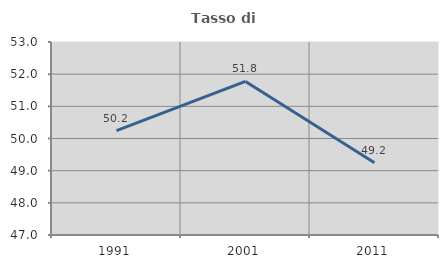
| Category | Tasso di occupazione   |
|---|---|
| 1991.0 | 50.245 |
| 2001.0 | 51.774 |
| 2011.0 | 49.243 |